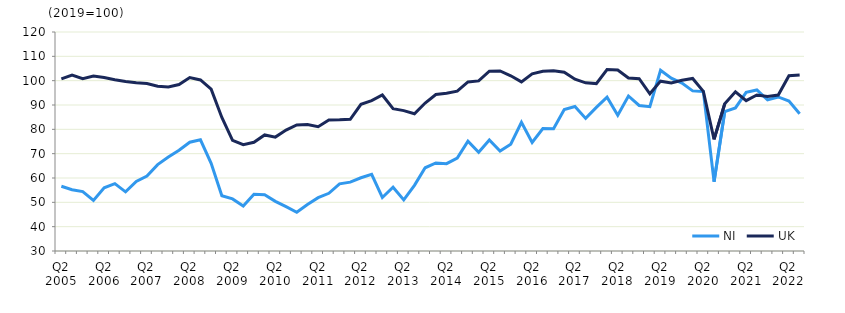
| Category | NI | UK  |
|---|---|---|
| Q2 2005 | 56.6 | 100.7 |
|  | 55.2 | 102.3 |
| Q4 2005 | 54.4 | 100.8 |
|  | 50.8 | 101.9 |
| Q2 2006 | 56 | 101.3 |
|  | 57.7 | 100.4 |
| Q4 2006 | 54.3 | 99.7 |
|  | 58.6 | 99.1 |
| Q2 2007 | 60.8 | 98.8 |
|  | 65.5 | 97.7 |
| Q4 2007 | 68.6 | 97.4 |
|  | 71.4 | 98.4 |
| Q2 2008 | 74.7 | 101.3 |
|  | 75.7 | 100.3 |
| Q4 2008 | 66 | 96.5 |
|  | 52.7 | 84.9 |
| Q2 2009 | 51.4 | 75.5 |
|  | 48.5 | 73.7 |
| Q4 2009 | 53.3 | 74.7 |
|  | 53.1 | 77.7 |
| Q2 2010 | 50.4 | 76.8 |
|  | 48.2 | 79.7 |
| Q4 2010 | 45.9 | 81.8 |
|  | 49.1 | 82 |
| Q2 2011 | 51.9 | 81.1 |
|  | 53.7 | 83.8 |
| Q4 2011 | 57.6 | 83.9 |
|  | 58.3 | 84.1 |
| Q2 2012 | 60.1 | 90.3 |
|  | 61.5 | 91.8 |
| Q4 2012 | 52 | 94.1 |
|  | 56.2 | 88.5 |
| Q2 2013 | 51 | 87.7 |
|  | 57 | 86.4 |
| Q4 2013 | 64.2 | 90.8 |
|  | 66.2 | 94.3 |
| Q2 2014 | 65.9 | 94.8 |
|  | 68.2 | 95.7 |
| Q4 2014 | 75.1 | 99.5 |
|  | 70.6 | 99.9 |
| Q2 2015 | 75.6 | 103.9 |
|  | 71.1 | 104 |
| Q4 2015 | 73.9 | 102 |
|  | 82.9 | 99.5 |
| Q2 2016 | 74.6 | 102.8 |
|  | 80.3 | 103.9 |
| Q4 2016 | 80.2 | 104.1 |
|  | 88.1 | 103.5 |
| Q2 2017 | 89.4 | 100.6 |
|  | 84.5 | 99.1 |
| Q4 2017 | 89 | 98.8 |
|  | 93.2 | 104.6 |
| Q2 2018 | 85.8 | 104.4 |
|  | 93.7 | 101.1 |
| Q4 2018 | 89.8 | 100.8 |
|  | 89.3 | 94.6 |
| Q2 2019 | 104.3 | 99.8 |
|  | 101 | 99.1 |
| Q4 2019 | 99 | 100.2 |
|  | 95.8 | 100.9 |
| Q2 2020 | 95.5 | 95.6 |
|  | 58.5 | 75.9 |
| Q4 2020 | 87.3 | 90.5 |
|  | 88.8 | 95.4 |
| Q2 2021 | 95.2 | 91.8 |
|  | 96.2 | 94.1 |
| Q4 2021 | 92.1 | 93.5 |
|  | 93.3 | 94.1 |
| Q2 2022 | 91.6 | 102 |